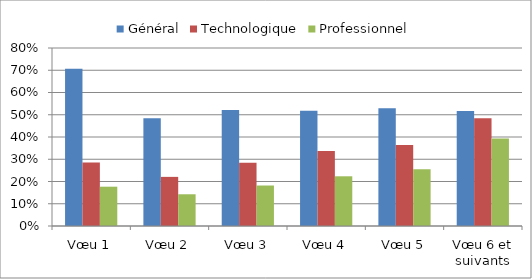
| Category | Général | Technologique | Professionnel |
|---|---|---|---|
| Vœu 1 | 0.707 | 0.285 | 0.177 |
| Vœu 2 | 0.485 | 0.221 | 0.143 |
| Vœu 3 | 0.521 | 0.284 | 0.182 |
| Vœu 4 | 0.519 | 0.338 | 0.223 |
| Vœu 5 | 0.529 | 0.364 | 0.255 |
| Vœu 6 et suivants | 0.517 | 0.484 | 0.393 |